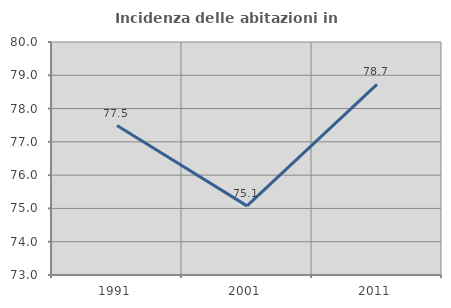
| Category | Incidenza delle abitazioni in proprietà  |
|---|---|
| 1991.0 | 77.491 |
| 2001.0 | 75.077 |
| 2011.0 | 78.728 |